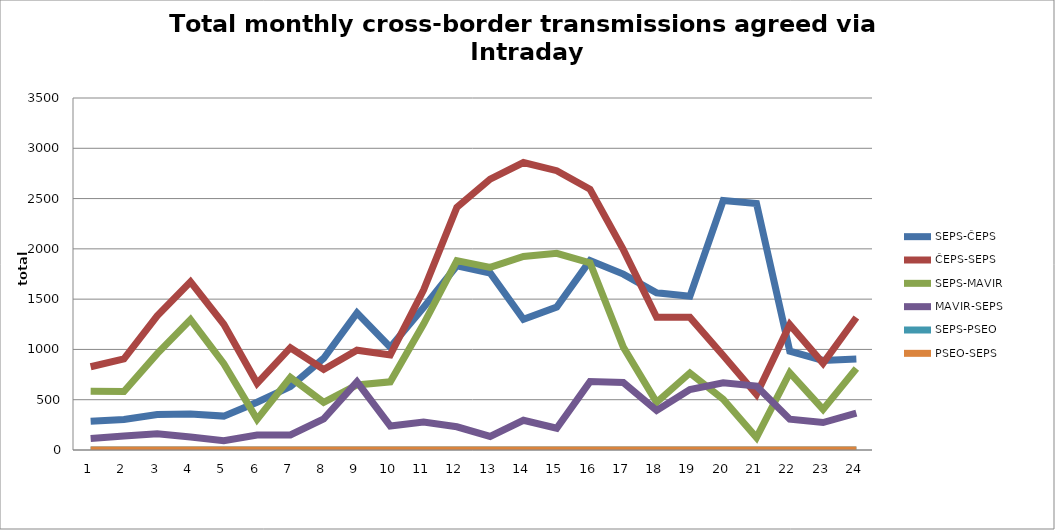
| Category | SEPS-ČEPS | ČEPS-SEPS | SEPS-MAVIR | MAVIR-SEPS | SEPS-PSEO | PSEO-SEPS |
|---|---|---|---|---|---|---|
| 1.0 | 286 | 828 | 584 | 115 | 0 | 0 |
| 2.0 | 304 | 907 | 581 | 139 | 0 | 0 |
| 3.0 | 352 | 1334 | 958 | 162 | 0 | 0 |
| 4.0 | 359 | 1672 | 1297 | 129 | 0 | 0 |
| 5.0 | 337 | 1250 | 858 | 92 | 0 | 0 |
| 6.0 | 475 | 663 | 305 | 149 | 0 | 0 |
| 7.0 | 630 | 1017 | 722 | 150 | 0 | 0 |
| 8.0 | 912 | 801 | 474 | 310 | 0 | 0 |
| 9.0 | 1364 | 992 | 647 | 678 | 0 | 0 |
| 10.0 | 1022 | 945 | 678 | 239 | 0 | 0 |
| 11.0 | 1418 | 1590 | 1252 | 277 | 0 | 0 |
| 12.0 | 1832 | 2413 | 1883 | 231 | 0 | 0 |
| 13.0 | 1760 | 2693 | 1816 | 135 | 0 | 0 |
| 14.0 | 1300 | 2858 | 1924 | 296 | 0 | 0 |
| 15.0 | 1422 | 2777 | 1955 | 217 | 0 | 0 |
| 16.0 | 1883 | 2592 | 1861 | 680 | 0 | 0 |
| 17.0 | 1749 | 1992 | 1023 | 671 | 0 | 0 |
| 18.0 | 1563 | 1320 | 474 | 393 | 0 | 0 |
| 19.0 | 1528 | 1319 | 766 | 602 | 0 | 0 |
| 20.0 | 2481 | 939 | 505 | 669 | 0 | 0 |
| 21.0 | 2451 | 552 | 124 | 636 | 0 | 0 |
| 22.0 | 983 | 1246 | 768 | 307 | 0 | 0 |
| 23.0 | 891 | 862 | 403 | 273 | 0 | 0 |
| 24.0 | 906 | 1318 | 811 | 367 | 0 | 0 |